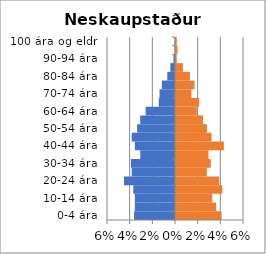
| Category | % karlar | %konur |
|---|---|---|
| 0-4 ára | -0.036 | 0.04 |
| 5-9 ára | -0.035 | 0.035 |
| 10-14 ára | -0.035 | 0.032 |
| 15-19 ára | -0.037 | 0.041 |
| 20-24 ára | -0.045 | 0.038 |
| 25-29 ára | -0.038 | 0.027 |
| 30-34 ára | -0.039 | 0.031 |
| 35-39 ára | -0.031 | 0.029 |
| 40-44 ára | -0.035 | 0.042 |
| 45-49 ára | -0.038 | 0.031 |
| 50-54 ára | -0.033 | 0.027 |
| 55-59 ára | -0.031 | 0.024 |
| 60-64 ára | -0.026 | 0.018 |
| 65-69 ára | -0.014 | 0.02 |
| 70-74 ára | -0.014 | 0.014 |
| 75-79 ára | -0.012 | 0.016 |
| 80-84 ára | -0.007 | 0.012 |
| 85-89 ára | -0.004 | 0.006 |
| 90-94 ára | -0.001 | 0.001 |
| 95-99 ára | 0 | 0.001 |
| 100 ára og eldri | 0 | 0.001 |